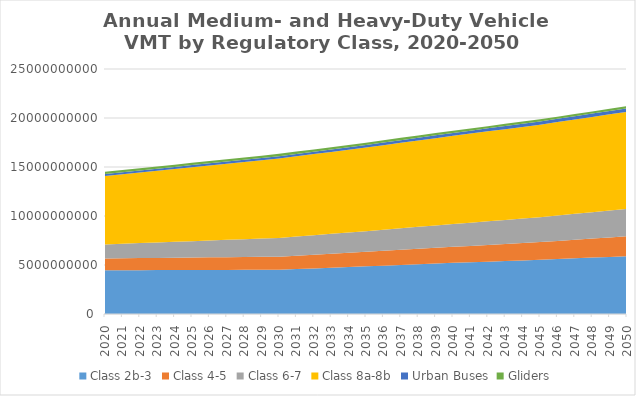
| Category | Class 2b-3 | Class 4-5 | Class 6-7 | Class 8a-8b | Urban Buses | Gliders |
|---|---|---|---|---|---|---|
| 2020.0 | 4464779356.615 | 1204070852.308 | 1432871610 | 6972399896.615 | 210785791.923 | 218292238.385 |
| 2021.0 | 4469573982.154 | 1217709735.077 | 1480608310 | 7086519570.154 | 212187796.7 | 220503552.846 |
| 2022.0 | 4474368607.692 | 1231348617.846 | 1528345010 | 7200639243.692 | 213589801.476 | 222714867.308 |
| 2023.0 | 4479163233.231 | 1244987500.615 | 1576081710 | 7314758917.231 | 214991806.252 | 224926181.769 |
| 2024.0 | 4483957858.769 | 1258626383.385 | 1623818410 | 7428878590.769 | 216393811.029 | 227137496.231 |
| 2025.0 | 4488752484.308 | 1272265266.154 | 1671555110 | 7542998264.308 | 217795815.805 | 229348810.692 |
| 2026.0 | 4493547109.846 | 1285904148.923 | 1719291810 | 7657117937.846 | 219197820.582 | 231560125.154 |
| 2027.0 | 4498341735.385 | 1299543031.692 | 1767028510 | 7771237611.385 | 220599825.358 | 233771439.615 |
| 2028.0 | 4503136360.923 | 1313181914.462 | 1814765210 | 7885357284.923 | 222001830.135 | 235982754.077 |
| 2029.0 | 4507930986.462 | 1326820797.231 | 1862501910 | 7999476958.462 | 223403834.911 | 238194068.538 |
| 2030.0 | 4512725612 | 1340459680 | 1910238610 | 8113596632 | 224805839.688 | 240405383 |
| 2031.0 | 4582965123.182 | 1367908975.783 | 1950450023.209 | 8197781330.969 | 231490160.107 | 239430268.818 |
| 2032.0 | 4653204634.364 | 1395358271.566 | 1990661436.417 | 8281966029.939 | 238174480.527 | 238455154.635 |
| 2033.0 | 4723444145.545 | 1422807567.35 | 2030872849.626 | 8366150728.908 | 244858800.946 | 237480040.453 |
| 2034.0 | 4793683656.727 | 1450256863.133 | 2071084262.835 | 8450335427.878 | 251543121.366 | 236504926.271 |
| 2035.0 | 4863923167.909 | 1477706158.916 | 2111295676.044 | 8534520126.847 | 258227441.785 | 235529812.088 |
| 2036.0 | 4934765825.527 | 1508896146.733 | 2155385734.035 | 8627655115.878 | 265549388.091 | 234368475.671 |
| 2037.0 | 5005608483.145 | 1540086134.55 | 2199475792.026 | 8720790104.908 | 272871334.396 | 233207139.253 |
| 2038.0 | 5076451140.764 | 1571276122.366 | 2243565850.017 | 8813925093.939 | 280193280.702 | 232045802.835 |
| 2039.0 | 5147293798.382 | 1602466110.183 | 2287655908.009 | 8907060082.969 | 287515227.007 | 230884466.418 |
| 2040.0 | 5218136456 | 1633656098 | 2331745966 | 9000195072 | 294837173.312 | 229723130 |
| 2041.0 | 5279433169.016 | 1669877234.387 | 2373477811.069 | 9087678528.833 | 300714707.057 | 227943660.859 |
| 2042.0 | 5340729882.031 | 1706098370.774 | 2415209656.137 | 9175161985.667 | 306592240.801 | 226164191.718 |
| 2043.0 | 5402026595.047 | 1742319507.162 | 2456941501.206 | 9262645442.5 | 312469774.545 | 224384722.577 |
| 2044.0 | 5463323308.062 | 1778540643.549 | 2498673346.274 | 9350128899.333 | 318347308.289 | 222605253.436 |
| 2045.0 | 5524620021.078 | 1814761779.936 | 2540405191.343 | 9437612356.167 | 324224842.033 | 220825784.295 |
| 2046.0 | 5600656437.662 | 1857984643.949 | 2590498877.074 | 9532795990.533 | 330433042.064 | 219546194.036 |
| 2047.0 | 5676692854.247 | 1901207507.962 | 2640592562.806 | 9627979624.9 | 336641242.095 | 218266603.777 |
| 2048.0 | 5752729270.831 | 1944430371.974 | 2690686248.537 | 9723163259.267 | 342849442.126 | 216987013.518 |
| 2049.0 | 5828765687.416 | 1987653235.987 | 2740779934.269 | 9818346893.633 | 349057642.157 | 215707423.259 |
| 2050.0 | 5904802104 | 2030876100 | 2790873620 | 9913530528 | 355265842.188 | 214427833 |